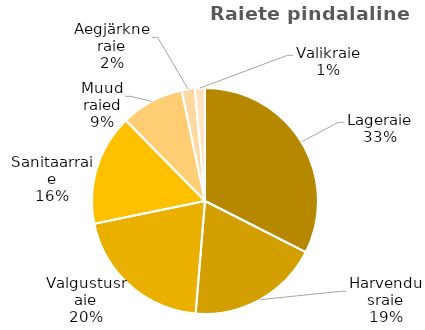
| Category | Series 0 |
|---|---|
| Lageraie | 32.645 |
| Harvendusraie | 18.939 |
| Valgustusraie | 20.566 |
| Sanitaarraie | 15.936 |
| Muud raied | 9.095 |
| Aegjärkne raie | 1.885 |
| Valikraie | 1.45 |